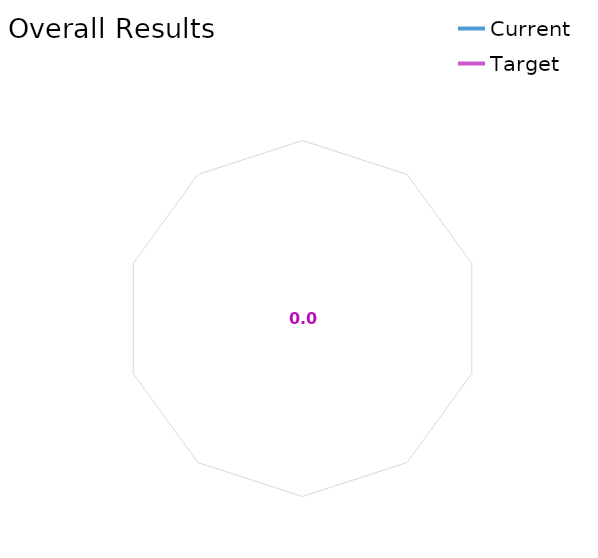
| Category | Current | Target |
|---|---|---|
| Overall average | 0 | 0 |
| 1 Strategy and Commissioning average | 0 | 0 |
| 2 Leadership and Resourcing average | 0 | 0 |
| 3 Governance and Risk average | 0 | 0 |
| 4 Commercial and Supplier Management average | 0 | 0 |
| 5 Partnerships average | 0 | 0 |
| 6 Culture, Skills and Readiness average | 0 | 0 |
| 7 Communications and Engagement average | 0 | 0 |
| 8 Pathways and Services average | 0 | 0 |
| 9 Innovation and Data average | 0 | 0 |